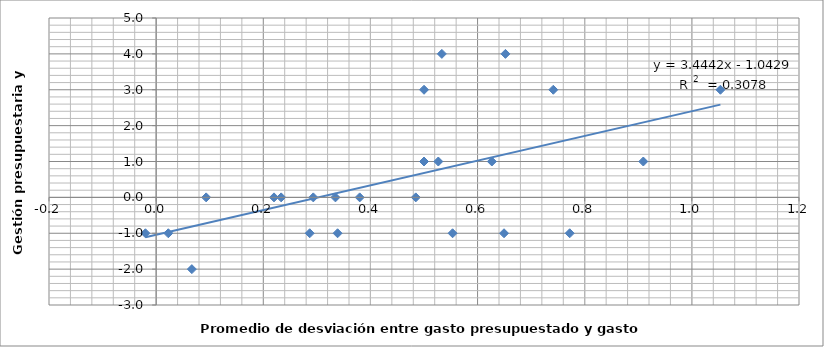
| Category | Cambios |
|---|---|
| 0.29333333333333345 | 0 |
| 0.5000000000000002 | 3 |
| 0.5266666666666664 | 1 |
| 0.33466666666666667 | 0 |
| 0.2333333333333325 | 0 |
| 0.09333333333333371 | 0 |
| 0.06666666666666732 | -2 |
| 0.3386666666666671 | -1 |
| -0.020000000000000018 | -1 |
| 0.7719999999999998 | -1 |
| 0.48466666666666747 | 0 |
| 0.6266666666666665 | 1 |
| 0.7413333333333336 | 3 |
| 0.9093333333333329 | 1 |
| 0.5000000000000004 | 1 |
| 1.0533333333333332 | 3 |
| 0.6520000000000001 | 4 |
| 0.2866666666666666 | -1 |
| 0.2200000000000002 | 0 |
| 0.37999999999999945 | 0 |
| 0.6493333333333324 | -1 |
| 0.02266666666666639 | -1 |
| 0.5333333333333339 | 4 |
| 0.5533333333333332 | -1 |